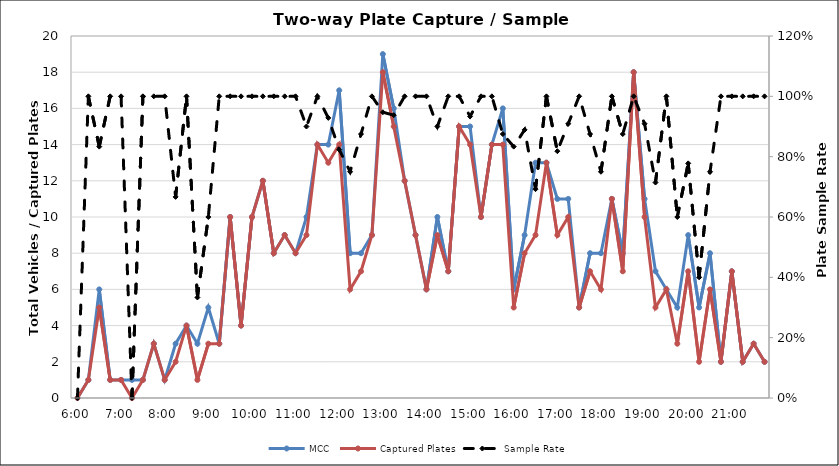
| Category | MCC | Captured Plates |
|---|---|---|
| 0.25 | 0 | 0 |
| 0.260416666666667 | 1 | 1 |
| 0.270833333333333 | 6 | 5 |
| 0.28125 | 1 | 1 |
| 0.291666666666667 | 1 | 1 |
| 0.302083333333333 | 1 | 0 |
| 0.3125 | 1 | 1 |
| 0.322916666666667 | 3 | 3 |
| 0.333333333333333 | 1 | 1 |
| 0.34375 | 3 | 2 |
| 0.354166666666667 | 4 | 4 |
| 0.364583333333333 | 3 | 1 |
| 0.375 | 5 | 3 |
| 0.385416666666667 | 3 | 3 |
| 0.395833333333333 | 10 | 10 |
| 0.40625 | 4 | 4 |
| 0.416666666666667 | 10 | 10 |
| 0.427083333333333 | 12 | 12 |
| 0.4375 | 8 | 8 |
| 0.447916666666667 | 9 | 9 |
| 0.458333333333333 | 8 | 8 |
| 0.46875 | 10 | 9 |
| 0.479166666666667 | 14 | 14 |
| 0.489583333333333 | 14 | 13 |
| 0.5 | 17 | 14 |
| 0.510416666666667 | 8 | 6 |
| 0.520833333333333 | 8 | 7 |
| 0.53125 | 9 | 9 |
| 0.541666666666667 | 19 | 18 |
| 0.552083333333333 | 16 | 15 |
| 0.5625 | 12 | 12 |
| 0.572916666666667 | 9 | 9 |
| 0.583333333333333 | 6 | 6 |
| 0.59375 | 10 | 9 |
| 0.604166666666667 | 7 | 7 |
| 0.614583333333333 | 15 | 15 |
| 0.625 | 15 | 14 |
| 0.635416666666667 | 10 | 10 |
| 0.645833333333333 | 14 | 14 |
| 0.65625 | 16 | 14 |
| 0.666666666666667 | 6 | 5 |
| 0.677083333333333 | 9 | 8 |
| 0.6875 | 13 | 9 |
| 0.697916666666667 | 13 | 13 |
| 0.708333333333333 | 11 | 9 |
| 0.71875 | 11 | 10 |
| 0.729166666666667 | 5 | 5 |
| 0.739583333333333 | 8 | 7 |
| 0.75 | 8 | 6 |
| 0.760416666666667 | 11 | 11 |
| 0.770833333333333 | 8 | 7 |
| 0.78125 | 18 | 18 |
| 0.791666666666667 | 11 | 10 |
| 0.802083333333333 | 7 | 5 |
| 0.8125 | 6 | 6 |
| 0.822916666666667 | 5 | 3 |
| 0.833333333333333 | 9 | 7 |
| 0.84375 | 5 | 2 |
| 0.854166666666667 | 8 | 6 |
| 0.864583333333333 | 2 | 2 |
| 0.875 | 7 | 7 |
| 0.885416666666667 | 2 | 2 |
| 0.895833333333333 | 3 | 3 |
| 0.90625 | 2 | 2 |